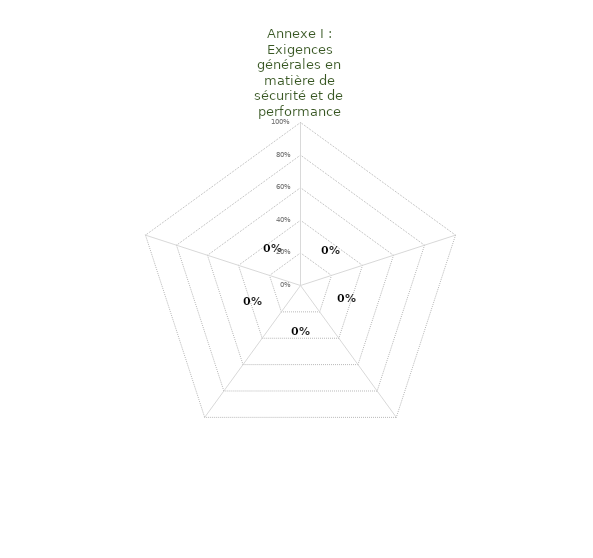
| Category | Annexes |
|---|---|
| Annexe I : Exigences générales en matière de sécurité et de performance | 0 |
| Annexe II : Documentation technique | 0 |
| Annexe III : Documentation relative à la surveillance post commercialisation | 0 |
| Annexe VI : Informations à fournir lors de l'enregistrment des dispositifs et des orpérateurs économiques et système IUD | 0 |
| Annexe XIV : Evaluation clinique & suivi clinique àpres commercialisation | 0 |